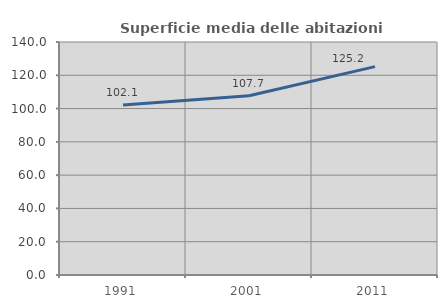
| Category | Superficie media delle abitazioni occupate |
|---|---|
| 1991.0 | 102.096 |
| 2001.0 | 107.705 |
| 2011.0 | 125.201 |